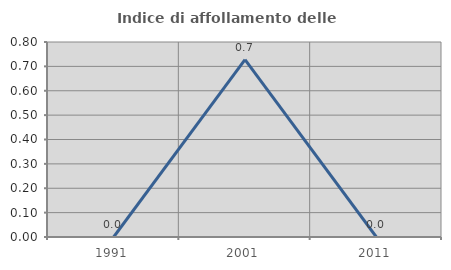
| Category | Indice di affollamento delle abitazioni  |
|---|---|
| 1991.0 | 0 |
| 2001.0 | 0.727 |
| 2011.0 | 0 |